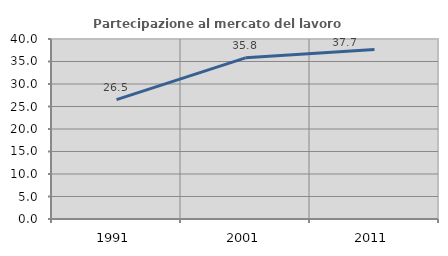
| Category | Partecipazione al mercato del lavoro  femminile |
|---|---|
| 1991.0 | 26.543 |
| 2001.0 | 35.815 |
| 2011.0 | 37.681 |